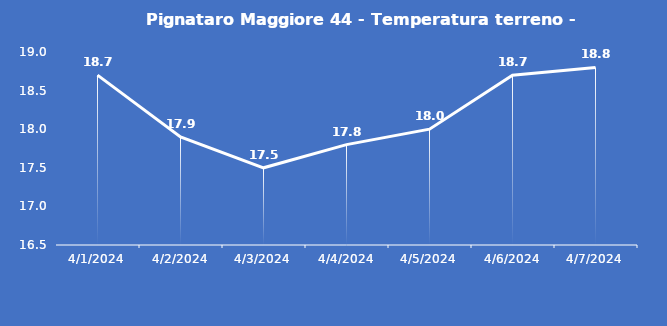
| Category | Pignataro Maggiore 44 - Temperatura terreno - Grezzo (°C) |
|---|---|
| 4/1/24 | 18.7 |
| 4/2/24 | 17.9 |
| 4/3/24 | 17.5 |
| 4/4/24 | 17.8 |
| 4/5/24 | 18 |
| 4/6/24 | 18.7 |
| 4/7/24 | 18.8 |